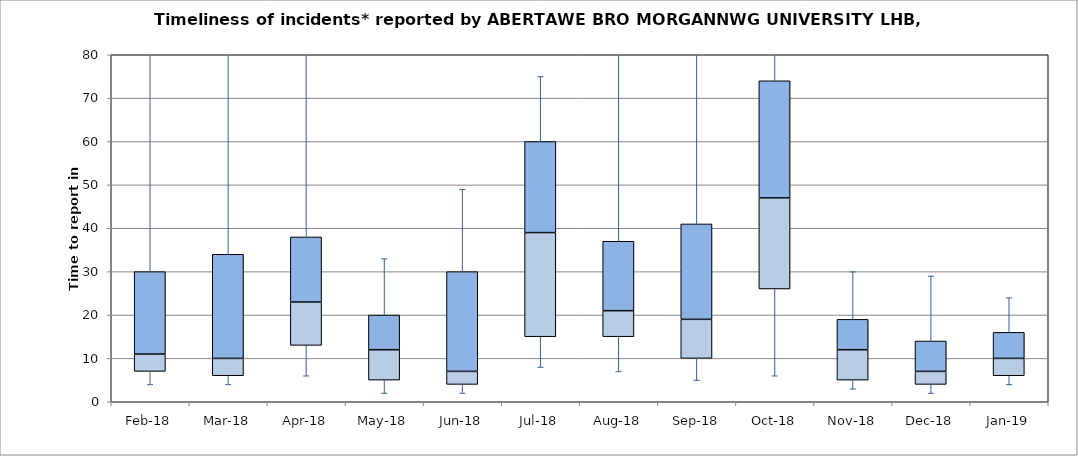
| Category | Series 0 | Series 1 | Series 2 |
|---|---|---|---|
| Feb-18 | 7 | 4 | 19 |
| Mar-18 | 6 | 4 | 24 |
| Apr-18 | 13 | 10 | 15 |
| May-18 | 5 | 7 | 8 |
| Jun-18 | 4 | 3 | 23 |
| Jul-18 | 15 | 24 | 21 |
| Aug-18 | 15 | 6 | 16 |
| Sep-18 | 10 | 9 | 22 |
| Oct-18 | 26 | 21 | 27 |
| Nov-18 | 5 | 7 | 7 |
| Dec-18 | 4 | 3 | 7 |
| Jan-19 | 6 | 4 | 6 |